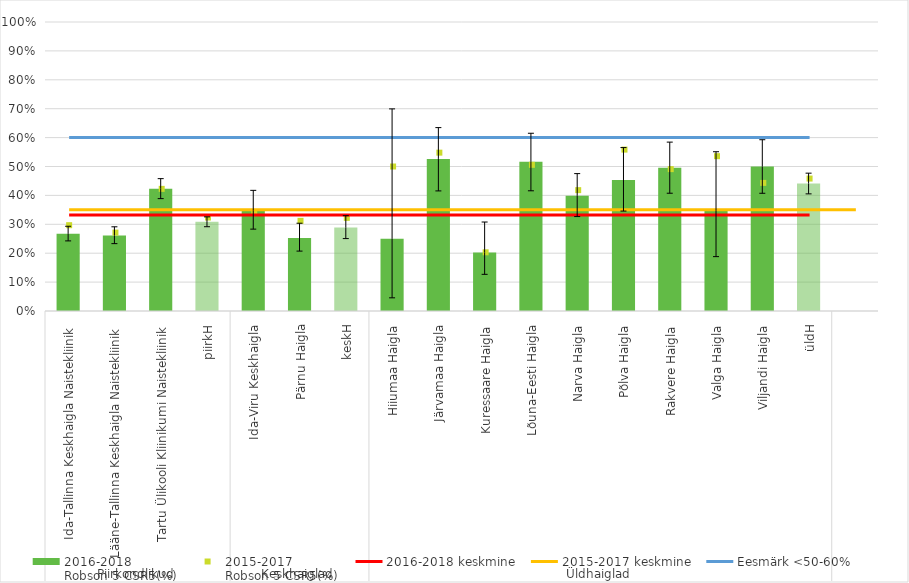
| Category | 2016-2018
Robson 5 CSR5(%) |
|---|---|
| 0 | 0.267 |
| 1 | 0.261 |
| 2 | 0.423 |
| 3 | 0.308 |
| 4 | 0.347 |
| 5 | 0.252 |
| 6 | 0.289 |
| 7 | 0.25 |
| 8 | 0.526 |
| 9 | 0.203 |
| 10 | 0.516 |
| 11 | 0.399 |
| 12 | 0.453 |
| 13 | 0.496 |
| 14 | 0.348 |
| 15 | 0.5 |
| 16 | 0.441 |